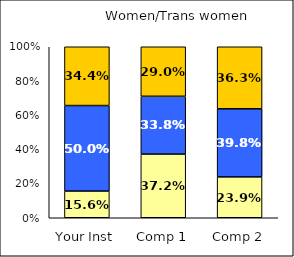
| Category | Low Institutional Priority: Commitment to Diversity | Average Institutional Priority: Commitment to Diversity | High Institutional Priority: Commitment to Diversity |
|---|---|---|---|
| Your Inst | 0.156 | 0.5 | 0.344 |
| Comp 1 | 0.372 | 0.338 | 0.29 |
| Comp 2 | 0.239 | 0.398 | 0.363 |